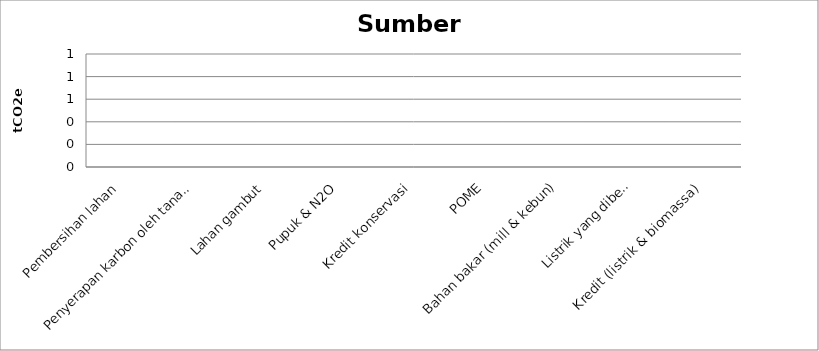
| Category | tCO2e |
|---|---|
| Pembersihan lahan | 0 |
| Penyerapan karbon oleh tanaman | 0 |
| Lahan gambut | 0 |
| Pupuk & N2O | 0 |
| Kredit konservasi | 0 |
| POME | 0 |
| Bahan bakar (mill & kebun) | 0 |
| Listrik yang dibeli | 0 |
| Kredit (listrik & biomassa) | 0 |